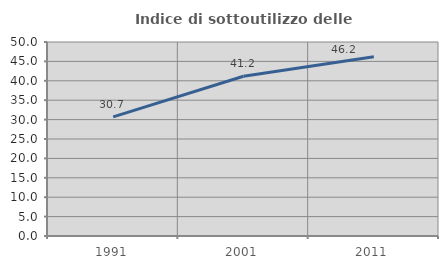
| Category | Indice di sottoutilizzo delle abitazioni  |
|---|---|
| 1991.0 | 30.688 |
| 2001.0 | 41.163 |
| 2011.0 | 46.204 |